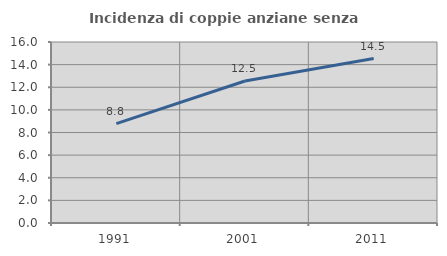
| Category | Incidenza di coppie anziane senza figli  |
|---|---|
| 1991.0 | 8.791 |
| 2001.0 | 12.548 |
| 2011.0 | 14.539 |